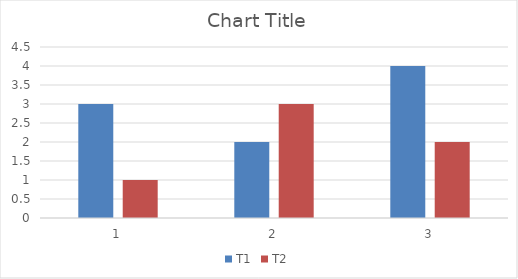
| Category | T1 | T2 |
|---|---|---|
| 0 | 3 | 1 |
| 1 | 2 | 3 |
| 2 | 4 | 2 |